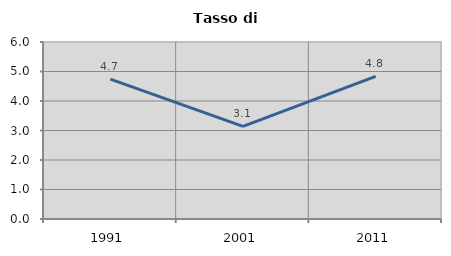
| Category | Tasso di disoccupazione   |
|---|---|
| 1991.0 | 4.74 |
| 2001.0 | 3.141 |
| 2011.0 | 4.834 |